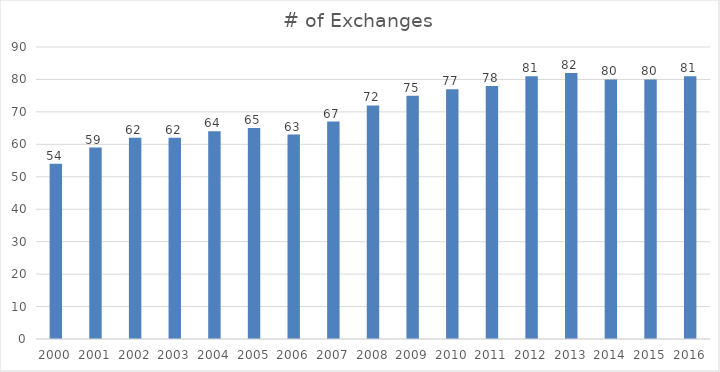
| Category | # of Exchanges |
|---|---|
| 2000.0 | 54 |
| 2001.0 | 59 |
| 2002.0 | 62 |
| 2003.0 | 62 |
| 2004.0 | 64 |
| 2005.0 | 65 |
| 2006.0 | 63 |
| 2007.0 | 67 |
| 2008.0 | 72 |
| 2009.0 | 75 |
| 2010.0 | 77 |
| 2011.0 | 78 |
| 2012.0 | 81 |
| 2013.0 | 82 |
| 2014.0 | 80 |
| 2015.0 | 80 |
| 2016.0 | 81 |